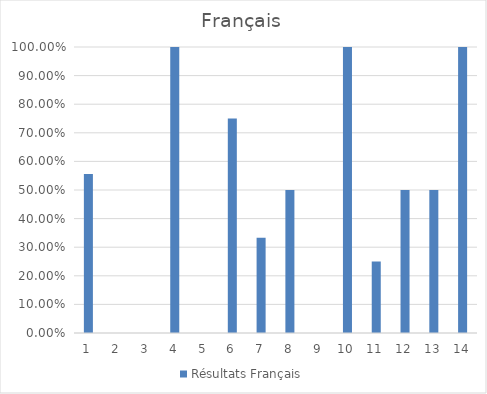
| Category | Résultats Français |
|---|---|
| 0 | 0.556 |
| 1 | 0 |
| 2 | 0 |
| 3 | 1 |
| 4 | 0 |
| 5 | 0.75 |
| 6 | 0.333 |
| 7 | 0.5 |
| 8 | 0 |
| 9 | 1 |
| 10 | 0.25 |
| 11 | 0.5 |
| 12 | 0.5 |
| 13 | 1 |